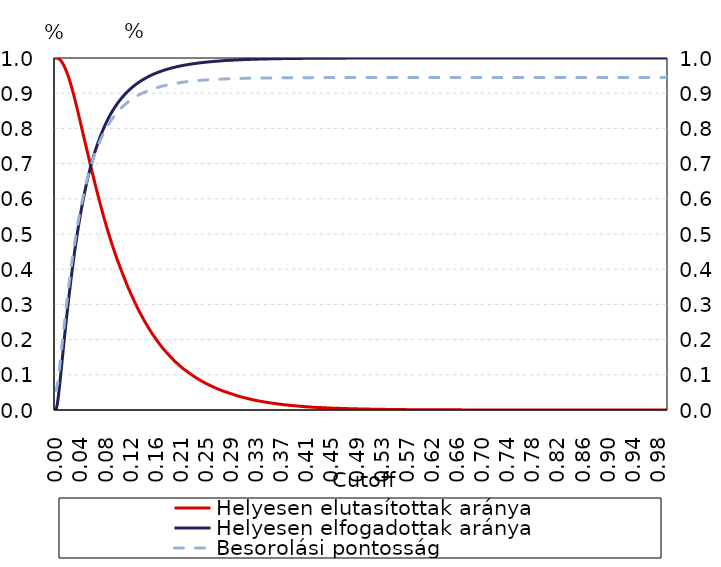
| Category | Helyesen elutasítottak aránya | Helyesen elfogadottak aránya |
|---|---|---|
| 0.0 | 1 | 0 |
| 0.001 | 1 | 0.002 |
| 0.002 | 1 | 0.006 |
| 0.003 | 1 | 0.014 |
| 0.004 | 0.999 | 0.025 |
| 0.005 | 0.999 | 0.039 |
| 0.006 | 0.998 | 0.054 |
| 0.007 | 0.996 | 0.07 |
| 0.008 | 0.995 | 0.086 |
| 0.009 | 0.993 | 0.103 |
| 0.01 | 0.99 | 0.121 |
| 0.011 | 0.988 | 0.138 |
| 0.012 | 0.985 | 0.155 |
| 0.013 | 0.982 | 0.172 |
| 0.014 | 0.979 | 0.19 |
| 0.015 | 0.975 | 0.207 |
| 0.016 | 0.971 | 0.223 |
| 0.017 | 0.967 | 0.24 |
| 0.018 | 0.963 | 0.256 |
| 0.019 | 0.958 | 0.272 |
| 0.02 | 0.954 | 0.288 |
| 0.021 | 0.949 | 0.303 |
| 0.022 | 0.944 | 0.318 |
| 0.023 | 0.938 | 0.333 |
| 0.024 | 0.933 | 0.348 |
| 0.025 | 0.927 | 0.362 |
| 0.026 | 0.921 | 0.376 |
| 0.027 | 0.915 | 0.39 |
| 0.028 | 0.909 | 0.404 |
| 0.029 | 0.902 | 0.417 |
| 0.03 | 0.896 | 0.43 |
| 0.031 | 0.889 | 0.443 |
| 0.032 | 0.882 | 0.455 |
| 0.033 | 0.875 | 0.467 |
| 0.034 | 0.868 | 0.479 |
| 0.035 | 0.861 | 0.491 |
| 0.036 | 0.854 | 0.502 |
| 0.037 | 0.847 | 0.513 |
| 0.038 | 0.839 | 0.524 |
| 0.039 | 0.832 | 0.535 |
| 0.04 | 0.825 | 0.545 |
| 0.041 | 0.818 | 0.555 |
| 0.042 | 0.81 | 0.565 |
| 0.043 | 0.802 | 0.575 |
| 0.044 | 0.795 | 0.584 |
| 0.045 | 0.787 | 0.593 |
| 0.046 | 0.779 | 0.602 |
| 0.047 | 0.772 | 0.611 |
| 0.048 | 0.765 | 0.619 |
| 0.049 | 0.758 | 0.627 |
| 0.05 | 0.75 | 0.635 |
| 0.051 | 0.743 | 0.643 |
| 0.052 | 0.736 | 0.651 |
| 0.053 | 0.728 | 0.659 |
| 0.054 | 0.721 | 0.666 |
| 0.055 | 0.714 | 0.673 |
| 0.056 | 0.707 | 0.68 |
| 0.057 | 0.699 | 0.687 |
| 0.058 | 0.692 | 0.693 |
| 0.059 | 0.685 | 0.699 |
| 0.06 | 0.677 | 0.706 |
| 0.061 | 0.67 | 0.712 |
| 0.062 | 0.663 | 0.718 |
| 0.063 | 0.656 | 0.724 |
| 0.064 | 0.649 | 0.729 |
| 0.065 | 0.642 | 0.735 |
| 0.066 | 0.635 | 0.74 |
| 0.067 | 0.628 | 0.746 |
| 0.068 | 0.621 | 0.751 |
| 0.069 | 0.615 | 0.756 |
| 0.07 | 0.608 | 0.761 |
| 0.071 | 0.601 | 0.766 |
| 0.072 | 0.595 | 0.77 |
| 0.073 | 0.588 | 0.775 |
| 0.074 | 0.581 | 0.779 |
| 0.075 | 0.575 | 0.784 |
| 0.076 | 0.569 | 0.788 |
| 0.077 | 0.562 | 0.792 |
| 0.078 | 0.556 | 0.797 |
| 0.079 | 0.549 | 0.801 |
| 0.08 | 0.543 | 0.805 |
| 0.081 | 0.537 | 0.808 |
| 0.082 | 0.531 | 0.812 |
| 0.083 | 0.525 | 0.816 |
| 0.084 | 0.519 | 0.82 |
| 0.085 | 0.513 | 0.823 |
| 0.086 | 0.508 | 0.827 |
| 0.087 | 0.502 | 0.83 |
| 0.088 | 0.496 | 0.833 |
| 0.089 | 0.49 | 0.836 |
| 0.09 | 0.485 | 0.839 |
| 0.091 | 0.48 | 0.843 |
| 0.092 | 0.474 | 0.846 |
| 0.093 | 0.469 | 0.848 |
| 0.094 | 0.463 | 0.851 |
| 0.095 | 0.458 | 0.854 |
| 0.096 | 0.453 | 0.857 |
| 0.097 | 0.448 | 0.86 |
| 0.098 | 0.443 | 0.862 |
| 0.099 | 0.438 | 0.865 |
| 0.1 | 0.433 | 0.867 |
| 0.101 | 0.428 | 0.87 |
| 0.102 | 0.423 | 0.872 |
| 0.103 | 0.419 | 0.875 |
| 0.104 | 0.414 | 0.877 |
| 0.105 | 0.409 | 0.879 |
| 0.106 | 0.405 | 0.881 |
| 0.107 | 0.4 | 0.883 |
| 0.108 | 0.396 | 0.886 |
| 0.109 | 0.391 | 0.888 |
| 0.11 | 0.387 | 0.89 |
| 0.111 | 0.382 | 0.892 |
| 0.112 | 0.378 | 0.894 |
| 0.113 | 0.373 | 0.896 |
| 0.114 | 0.369 | 0.898 |
| 0.115 | 0.365 | 0.899 |
| 0.116 | 0.36 | 0.901 |
| 0.117 | 0.356 | 0.903 |
| 0.118 | 0.352 | 0.905 |
| 0.119 | 0.348 | 0.906 |
| 0.12 | 0.344 | 0.908 |
| 0.121 | 0.34 | 0.91 |
| 0.122 | 0.336 | 0.911 |
| 0.123 | 0.332 | 0.913 |
| 0.124 | 0.328 | 0.914 |
| 0.125 | 0.324 | 0.916 |
| 0.126 | 0.321 | 0.917 |
| 0.127 | 0.317 | 0.919 |
| 0.128 | 0.313 | 0.92 |
| 0.129 | 0.309 | 0.922 |
| 0.13 | 0.305 | 0.923 |
| 0.131 | 0.302 | 0.924 |
| 0.132 | 0.298 | 0.925 |
| 0.133 | 0.295 | 0.927 |
| 0.134 | 0.291 | 0.928 |
| 0.135 | 0.287 | 0.929 |
| 0.136 | 0.284 | 0.93 |
| 0.137 | 0.28 | 0.932 |
| 0.138 | 0.277 | 0.933 |
| 0.139 | 0.274 | 0.934 |
| 0.14 | 0.271 | 0.935 |
| 0.141 | 0.268 | 0.936 |
| 0.142 | 0.264 | 0.937 |
| 0.143 | 0.261 | 0.938 |
| 0.144 | 0.258 | 0.939 |
| 0.145 | 0.255 | 0.94 |
| 0.146 | 0.251 | 0.941 |
| 0.147 | 0.248 | 0.942 |
| 0.148 | 0.246 | 0.943 |
| 0.149 | 0.243 | 0.944 |
| 0.15 | 0.24 | 0.945 |
| 0.151 | 0.237 | 0.946 |
| 0.152 | 0.234 | 0.947 |
| 0.153 | 0.231 | 0.948 |
| 0.154 | 0.228 | 0.949 |
| 0.155 | 0.226 | 0.95 |
| 0.156 | 0.223 | 0.951 |
| 0.157 | 0.22 | 0.951 |
| 0.158 | 0.217 | 0.952 |
| 0.159 | 0.215 | 0.953 |
| 0.16 | 0.212 | 0.954 |
| 0.161 | 0.21 | 0.954 |
| 0.162 | 0.208 | 0.955 |
| 0.163 | 0.205 | 0.956 |
| 0.164 | 0.203 | 0.957 |
| 0.165 | 0.2 | 0.957 |
| 0.166 | 0.198 | 0.958 |
| 0.167 | 0.195 | 0.959 |
| 0.168 | 0.193 | 0.959 |
| 0.169 | 0.19 | 0.96 |
| 0.17 | 0.188 | 0.961 |
| 0.171 | 0.186 | 0.961 |
| 0.172 | 0.183 | 0.962 |
| 0.173 | 0.181 | 0.963 |
| 0.174 | 0.179 | 0.963 |
| 0.175 | 0.177 | 0.964 |
| 0.176 | 0.175 | 0.964 |
| 0.177 | 0.173 | 0.965 |
| 0.178 | 0.171 | 0.965 |
| 0.179 | 0.169 | 0.966 |
| 0.18 | 0.167 | 0.967 |
| 0.181 | 0.165 | 0.967 |
| 0.182 | 0.163 | 0.968 |
| 0.183 | 0.161 | 0.968 |
| 0.184 | 0.159 | 0.969 |
| 0.185 | 0.157 | 0.969 |
| 0.186 | 0.155 | 0.97 |
| 0.187 | 0.153 | 0.97 |
| 0.188 | 0.151 | 0.971 |
| 0.189 | 0.15 | 0.971 |
| 0.19 | 0.148 | 0.972 |
| 0.191 | 0.146 | 0.972 |
| 0.192 | 0.144 | 0.972 |
| 0.193 | 0.142 | 0.973 |
| 0.194 | 0.141 | 0.973 |
| 0.195 | 0.139 | 0.974 |
| 0.196 | 0.137 | 0.974 |
| 0.197 | 0.136 | 0.975 |
| 0.198 | 0.134 | 0.975 |
| 0.199 | 0.133 | 0.975 |
| 0.2 | 0.131 | 0.976 |
| 0.201 | 0.129 | 0.976 |
| 0.202 | 0.128 | 0.977 |
| 0.203 | 0.126 | 0.977 |
| 0.204 | 0.125 | 0.977 |
| 0.205 | 0.123 | 0.978 |
| 0.206 | 0.122 | 0.978 |
| 0.207 | 0.12 | 0.978 |
| 0.208 | 0.119 | 0.979 |
| 0.209 | 0.117 | 0.979 |
| 0.21 | 0.116 | 0.979 |
| 0.211 | 0.115 | 0.98 |
| 0.212 | 0.113 | 0.98 |
| 0.213 | 0.112 | 0.98 |
| 0.214 | 0.111 | 0.981 |
| 0.215 | 0.11 | 0.981 |
| 0.216 | 0.108 | 0.981 |
| 0.217 | 0.107 | 0.981 |
| 0.218 | 0.106 | 0.982 |
| 0.219 | 0.105 | 0.982 |
| 0.22 | 0.103 | 0.982 |
| 0.221 | 0.102 | 0.983 |
| 0.222 | 0.101 | 0.983 |
| 0.223 | 0.1 | 0.983 |
| 0.224 | 0.098 | 0.983 |
| 0.225 | 0.097 | 0.984 |
| 0.226 | 0.096 | 0.984 |
| 0.227 | 0.095 | 0.984 |
| 0.228 | 0.094 | 0.984 |
| 0.229 | 0.092 | 0.985 |
| 0.23 | 0.091 | 0.985 |
| 0.231 | 0.09 | 0.985 |
| 0.232 | 0.089 | 0.985 |
| 0.233 | 0.088 | 0.986 |
| 0.234 | 0.087 | 0.986 |
| 0.235 | 0.086 | 0.986 |
| 0.236 | 0.085 | 0.986 |
| 0.237 | 0.084 | 0.986 |
| 0.238 | 0.083 | 0.987 |
| 0.239 | 0.082 | 0.987 |
| 0.24 | 0.081 | 0.987 |
| 0.241 | 0.08 | 0.987 |
| 0.242 | 0.079 | 0.987 |
| 0.243 | 0.078 | 0.988 |
| 0.244 | 0.077 | 0.988 |
| 0.245 | 0.076 | 0.988 |
| 0.246 | 0.076 | 0.988 |
| 0.247 | 0.075 | 0.988 |
| 0.248 | 0.074 | 0.989 |
| 0.249 | 0.073 | 0.989 |
| 0.25 | 0.072 | 0.989 |
| 0.251 | 0.071 | 0.989 |
| 0.252 | 0.07 | 0.989 |
| 0.253 | 0.069 | 0.989 |
| 0.254 | 0.069 | 0.99 |
| 0.255 | 0.068 | 0.99 |
| 0.256 | 0.067 | 0.99 |
| 0.257 | 0.066 | 0.99 |
| 0.258 | 0.065 | 0.99 |
| 0.259 | 0.065 | 0.99 |
| 0.26 | 0.064 | 0.99 |
| 0.261 | 0.063 | 0.991 |
| 0.262 | 0.062 | 0.991 |
| 0.263 | 0.062 | 0.991 |
| 0.264 | 0.061 | 0.991 |
| 0.265 | 0.06 | 0.991 |
| 0.266 | 0.059 | 0.991 |
| 0.267 | 0.059 | 0.991 |
| 0.268 | 0.058 | 0.992 |
| 0.269 | 0.057 | 0.992 |
| 0.27 | 0.057 | 0.992 |
| 0.271 | 0.056 | 0.992 |
| 0.272 | 0.055 | 0.992 |
| 0.273 | 0.054 | 0.992 |
| 0.274 | 0.054 | 0.992 |
| 0.275 | 0.053 | 0.992 |
| 0.276 | 0.053 | 0.993 |
| 0.277 | 0.052 | 0.993 |
| 0.278 | 0.052 | 0.993 |
| 0.279 | 0.051 | 0.993 |
| 0.28 | 0.05 | 0.993 |
| 0.281 | 0.05 | 0.993 |
| 0.282 | 0.049 | 0.993 |
| 0.283 | 0.048 | 0.993 |
| 0.284 | 0.048 | 0.993 |
| 0.285 | 0.047 | 0.993 |
| 0.286 | 0.047 | 0.994 |
| 0.287 | 0.046 | 0.994 |
| 0.288 | 0.046 | 0.994 |
| 0.289 | 0.045 | 0.994 |
| 0.29 | 0.045 | 0.994 |
| 0.291 | 0.044 | 0.994 |
| 0.292 | 0.043 | 0.994 |
| 0.293 | 0.043 | 0.994 |
| 0.294 | 0.042 | 0.994 |
| 0.295 | 0.042 | 0.994 |
| 0.296 | 0.041 | 0.994 |
| 0.297 | 0.041 | 0.995 |
| 0.298 | 0.04 | 0.995 |
| 0.299 | 0.04 | 0.995 |
| 0.3 | 0.039 | 0.995 |
| 0.301 | 0.039 | 0.995 |
| 0.302 | 0.038 | 0.995 |
| 0.303 | 0.038 | 0.995 |
| 0.304 | 0.037 | 0.995 |
| 0.305 | 0.037 | 0.995 |
| 0.306 | 0.036 | 0.995 |
| 0.307 | 0.036 | 0.995 |
| 0.308 | 0.035 | 0.995 |
| 0.309 | 0.035 | 0.995 |
| 0.31 | 0.034 | 0.996 |
| 0.311 | 0.034 | 0.996 |
| 0.312 | 0.033 | 0.996 |
| 0.313 | 0.033 | 0.996 |
| 0.314 | 0.033 | 0.996 |
| 0.315 | 0.032 | 0.996 |
| 0.316 | 0.032 | 0.996 |
| 0.317 | 0.031 | 0.996 |
| 0.318 | 0.031 | 0.996 |
| 0.319 | 0.031 | 0.996 |
| 0.32 | 0.03 | 0.996 |
| 0.321 | 0.03 | 0.996 |
| 0.322 | 0.029 | 0.996 |
| 0.323 | 0.029 | 0.996 |
| 0.324 | 0.029 | 0.996 |
| 0.325 | 0.028 | 0.996 |
| 0.326 | 0.028 | 0.997 |
| 0.327 | 0.027 | 0.997 |
| 0.328 | 0.027 | 0.997 |
| 0.329 | 0.027 | 0.997 |
| 0.33 | 0.026 | 0.997 |
| 0.331 | 0.026 | 0.997 |
| 0.332 | 0.026 | 0.997 |
| 0.333 | 0.025 | 0.997 |
| 0.334 | 0.025 | 0.997 |
| 0.335 | 0.025 | 0.997 |
| 0.336 | 0.024 | 0.997 |
| 0.337 | 0.024 | 0.997 |
| 0.338 | 0.024 | 0.997 |
| 0.339 | 0.024 | 0.997 |
| 0.34 | 0.023 | 0.997 |
| 0.341 | 0.023 | 0.997 |
| 0.342 | 0.023 | 0.997 |
| 0.343 | 0.023 | 0.997 |
| 0.344 | 0.022 | 0.997 |
| 0.345 | 0.022 | 0.997 |
| 0.346 | 0.022 | 0.997 |
| 0.347 | 0.021 | 0.997 |
| 0.348 | 0.021 | 0.998 |
| 0.349 | 0.021 | 0.998 |
| 0.35 | 0.021 | 0.998 |
| 0.351 | 0.02 | 0.998 |
| 0.352 | 0.02 | 0.998 |
| 0.353 | 0.02 | 0.998 |
| 0.354 | 0.019 | 0.998 |
| 0.355 | 0.019 | 0.998 |
| 0.356 | 0.019 | 0.998 |
| 0.357 | 0.019 | 0.998 |
| 0.358 | 0.018 | 0.998 |
| 0.359 | 0.018 | 0.998 |
| 0.36 | 0.018 | 0.998 |
| 0.361 | 0.018 | 0.998 |
| 0.362 | 0.018 | 0.998 |
| 0.363 | 0.017 | 0.998 |
| 0.364 | 0.017 | 0.998 |
| 0.365 | 0.017 | 0.998 |
| 0.366 | 0.017 | 0.998 |
| 0.367 | 0.016 | 0.998 |
| 0.368 | 0.016 | 0.998 |
| 0.369 | 0.016 | 0.998 |
| 0.37 | 0.016 | 0.998 |
| 0.371 | 0.015 | 0.998 |
| 0.372 | 0.015 | 0.998 |
| 0.373 | 0.015 | 0.998 |
| 0.374 | 0.015 | 0.998 |
| 0.375 | 0.015 | 0.998 |
| 0.376 | 0.015 | 0.998 |
| 0.377 | 0.014 | 0.998 |
| 0.378 | 0.014 | 0.998 |
| 0.379 | 0.014 | 0.998 |
| 0.38 | 0.014 | 0.998 |
| 0.381 | 0.014 | 0.999 |
| 0.382 | 0.013 | 0.999 |
| 0.383 | 0.013 | 0.999 |
| 0.384 | 0.013 | 0.999 |
| 0.385 | 0.013 | 0.999 |
| 0.386 | 0.013 | 0.999 |
| 0.387 | 0.013 | 0.999 |
| 0.388 | 0.012 | 0.999 |
| 0.389 | 0.012 | 0.999 |
| 0.39 | 0.012 | 0.999 |
| 0.391 | 0.012 | 0.999 |
| 0.392 | 0.012 | 0.999 |
| 0.393 | 0.012 | 0.999 |
| 0.394 | 0.012 | 0.999 |
| 0.395 | 0.011 | 0.999 |
| 0.396 | 0.011 | 0.999 |
| 0.397 | 0.011 | 0.999 |
| 0.398 | 0.011 | 0.999 |
| 0.399 | 0.011 | 0.999 |
| 0.4 | 0.011 | 0.999 |
| 0.401 | 0.01 | 0.999 |
| 0.402 | 0.01 | 0.999 |
| 0.403 | 0.01 | 0.999 |
| 0.404 | 0.01 | 0.999 |
| 0.405 | 0.01 | 0.999 |
| 0.406 | 0.01 | 0.999 |
| 0.407 | 0.01 | 0.999 |
| 0.408 | 0.009 | 0.999 |
| 0.409 | 0.009 | 0.999 |
| 0.41 | 0.009 | 0.999 |
| 0.411 | 0.009 | 0.999 |
| 0.412 | 0.009 | 0.999 |
| 0.413 | 0.009 | 0.999 |
| 0.414 | 0.009 | 0.999 |
| 0.415 | 0.009 | 0.999 |
| 0.416 | 0.008 | 0.999 |
| 0.417 | 0.008 | 0.999 |
| 0.418 | 0.008 | 0.999 |
| 0.419 | 0.008 | 0.999 |
| 0.42 | 0.008 | 0.999 |
| 0.421 | 0.008 | 0.999 |
| 0.422 | 0.008 | 0.999 |
| 0.423 | 0.008 | 0.999 |
| 0.424 | 0.007 | 0.999 |
| 0.425 | 0.007 | 0.999 |
| 0.426 | 0.007 | 0.999 |
| 0.427 | 0.007 | 0.999 |
| 0.428 | 0.007 | 0.999 |
| 0.429 | 0.007 | 0.999 |
| 0.43 | 0.007 | 0.999 |
| 0.431 | 0.007 | 0.999 |
| 0.432 | 0.007 | 0.999 |
| 0.433 | 0.007 | 0.999 |
| 0.434 | 0.007 | 0.999 |
| 0.435 | 0.007 | 0.999 |
| 0.436 | 0.007 | 0.999 |
| 0.437 | 0.006 | 0.999 |
| 0.438 | 0.006 | 0.999 |
| 0.439 | 0.006 | 0.999 |
| 0.44 | 0.006 | 0.999 |
| 0.441 | 0.006 | 0.999 |
| 0.442 | 0.006 | 0.999 |
| 0.443 | 0.006 | 0.999 |
| 0.444 | 0.006 | 0.999 |
| 0.445 | 0.006 | 0.999 |
| 0.446 | 0.006 | 0.999 |
| 0.447 | 0.006 | 0.999 |
| 0.448 | 0.006 | 0.999 |
| 0.449 | 0.005 | 0.999 |
| 0.45 | 0.005 | 0.999 |
| 0.451 | 0.005 | 0.999 |
| 0.452 | 0.005 | 0.999 |
| 0.453 | 0.005 | 1 |
| 0.454 | 0.005 | 1 |
| 0.455 | 0.005 | 1 |
| 0.456 | 0.005 | 1 |
| 0.457 | 0.005 | 1 |
| 0.458 | 0.005 | 1 |
| 0.459 | 0.005 | 1 |
| 0.46 | 0.005 | 1 |
| 0.461 | 0.005 | 1 |
| 0.462 | 0.005 | 1 |
| 0.463 | 0.005 | 1 |
| 0.464 | 0.005 | 1 |
| 0.465 | 0.005 | 1 |
| 0.466 | 0.005 | 1 |
| 0.467 | 0.005 | 1 |
| 0.468 | 0.004 | 1 |
| 0.469 | 0.004 | 1 |
| 0.47 | 0.004 | 1 |
| 0.471 | 0.004 | 1 |
| 0.472 | 0.004 | 1 |
| 0.473 | 0.004 | 1 |
| 0.474 | 0.004 | 1 |
| 0.475 | 0.004 | 1 |
| 0.476 | 0.004 | 1 |
| 0.477 | 0.004 | 1 |
| 0.478 | 0.004 | 1 |
| 0.479 | 0.004 | 1 |
| 0.48 | 0.004 | 1 |
| 0.481 | 0.004 | 1 |
| 0.482 | 0.004 | 1 |
| 0.483 | 0.004 | 1 |
| 0.484 | 0.004 | 1 |
| 0.485 | 0.004 | 1 |
| 0.486 | 0.004 | 1 |
| 0.487 | 0.003 | 1 |
| 0.488 | 0.003 | 1 |
| 0.489 | 0.003 | 1 |
| 0.49 | 0.003 | 1 |
| 0.491 | 0.003 | 1 |
| 0.492 | 0.003 | 1 |
| 0.493 | 0.003 | 1 |
| 0.494 | 0.003 | 1 |
| 0.495 | 0.003 | 1 |
| 0.496 | 0.003 | 1 |
| 0.497 | 0.003 | 1 |
| 0.498 | 0.003 | 1 |
| 0.499 | 0.003 | 1 |
| 0.5 | 0.003 | 1 |
| 0.501 | 0.003 | 1 |
| 0.502 | 0.003 | 1 |
| 0.503 | 0.003 | 1 |
| 0.504 | 0.003 | 1 |
| 0.505 | 0.003 | 1 |
| 0.506 | 0.003 | 1 |
| 0.507 | 0.003 | 1 |
| 0.508 | 0.003 | 1 |
| 0.509 | 0.003 | 1 |
| 0.51 | 0.003 | 1 |
| 0.511 | 0.003 | 1 |
| 0.512 | 0.003 | 1 |
| 0.513 | 0.002 | 1 |
| 0.514 | 0.002 | 1 |
| 0.515 | 0.002 | 1 |
| 0.516 | 0.002 | 1 |
| 0.517 | 0.002 | 1 |
| 0.518 | 0.002 | 1 |
| 0.519 | 0.002 | 1 |
| 0.52 | 0.002 | 1 |
| 0.521 | 0.002 | 1 |
| 0.522 | 0.002 | 1 |
| 0.523 | 0.002 | 1 |
| 0.524 | 0.002 | 1 |
| 0.525 | 0.002 | 1 |
| 0.526 | 0.002 | 1 |
| 0.527 | 0.002 | 1 |
| 0.528 | 0.002 | 1 |
| 0.529 | 0.002 | 1 |
| 0.53 | 0.002 | 1 |
| 0.531 | 0.002 | 1 |
| 0.532 | 0.002 | 1 |
| 0.533 | 0.002 | 1 |
| 0.534 | 0.002 | 1 |
| 0.535 | 0.002 | 1 |
| 0.536 | 0.002 | 1 |
| 0.537 | 0.002 | 1 |
| 0.538 | 0.002 | 1 |
| 0.539 | 0.002 | 1 |
| 0.54 | 0.002 | 1 |
| 0.541 | 0.002 | 1 |
| 0.542 | 0.002 | 1 |
| 0.543 | 0.002 | 1 |
| 0.544 | 0.002 | 1 |
| 0.545 | 0.002 | 1 |
| 0.546 | 0.002 | 1 |
| 0.547 | 0.002 | 1 |
| 0.548 | 0.002 | 1 |
| 0.549 | 0.002 | 1 |
| 0.55 | 0.001 | 1 |
| 0.551 | 0.001 | 1 |
| 0.552 | 0.001 | 1 |
| 0.553 | 0.001 | 1 |
| 0.554 | 0.001 | 1 |
| 0.555 | 0.001 | 1 |
| 0.556 | 0.001 | 1 |
| 0.557 | 0.001 | 1 |
| 0.558 | 0.001 | 1 |
| 0.559 | 0.001 | 1 |
| 0.56 | 0.001 | 1 |
| 0.561 | 0.001 | 1 |
| 0.562 | 0.001 | 1 |
| 0.563 | 0.001 | 1 |
| 0.564 | 0.001 | 1 |
| 0.565 | 0.001 | 1 |
| 0.566 | 0.001 | 1 |
| 0.567 | 0.001 | 1 |
| 0.568 | 0.001 | 1 |
| 0.569 | 0.001 | 1 |
| 0.57 | 0.001 | 1 |
| 0.571 | 0.001 | 1 |
| 0.572 | 0.001 | 1 |
| 0.573 | 0.001 | 1 |
| 0.574 | 0.001 | 1 |
| 0.575 | 0.001 | 1 |
| 0.576 | 0.001 | 1 |
| 0.577 | 0.001 | 1 |
| 0.578 | 0.001 | 1 |
| 0.579 | 0.001 | 1 |
| 0.58 | 0.001 | 1 |
| 0.581 | 0.001 | 1 |
| 0.582 | 0.001 | 1 |
| 0.583 | 0.001 | 1 |
| 0.584 | 0.001 | 1 |
| 0.585 | 0.001 | 1 |
| 0.586 | 0.001 | 1 |
| 0.587 | 0.001 | 1 |
| 0.588 | 0.001 | 1 |
| 0.589 | 0.001 | 1 |
| 0.59 | 0.001 | 1 |
| 0.591 | 0.001 | 1 |
| 0.592 | 0.001 | 1 |
| 0.593 | 0.001 | 1 |
| 0.594 | 0.001 | 1 |
| 0.595 | 0.001 | 1 |
| 0.596 | 0.001 | 1 |
| 0.597 | 0.001 | 1 |
| 0.598 | 0.001 | 1 |
| 0.599 | 0.001 | 1 |
| 0.6 | 0.001 | 1 |
| 0.601 | 0.001 | 1 |
| 0.602 | 0.001 | 1 |
| 0.603 | 0.001 | 1 |
| 0.604 | 0.001 | 1 |
| 0.605 | 0.001 | 1 |
| 0.606 | 0.001 | 1 |
| 0.607 | 0.001 | 1 |
| 0.608 | 0.001 | 1 |
| 0.609 | 0.001 | 1 |
| 0.61 | 0.001 | 1 |
| 0.611 | 0.001 | 1 |
| 0.612 | 0.001 | 1 |
| 0.613 | 0.001 | 1 |
| 0.614 | 0.001 | 1 |
| 0.615 | 0.001 | 1 |
| 0.616 | 0.001 | 1 |
| 0.617 | 0.001 | 1 |
| 0.618 | 0.001 | 1 |
| 0.619 | 0.001 | 1 |
| 0.62 | 0.001 | 1 |
| 0.621 | 0.001 | 1 |
| 0.622 | 0.001 | 1 |
| 0.623 | 0.001 | 1 |
| 0.624 | 0.001 | 1 |
| 0.625 | 0.001 | 1 |
| 0.626 | 0.001 | 1 |
| 0.627 | 0.001 | 1 |
| 0.628 | 0.001 | 1 |
| 0.629 | 0.001 | 1 |
| 0.63 | 0.001 | 1 |
| 0.631 | 0.001 | 1 |
| 0.632 | 0.001 | 1 |
| 0.633 | 0.001 | 1 |
| 0.634 | 0.001 | 1 |
| 0.635 | 0.001 | 1 |
| 0.636 | 0.001 | 1 |
| 0.637 | 0.001 | 1 |
| 0.638 | 0 | 1 |
| 0.639 | 0 | 1 |
| 0.64 | 0 | 1 |
| 0.641 | 0 | 1 |
| 0.642 | 0 | 1 |
| 0.643 | 0 | 1 |
| 0.644 | 0 | 1 |
| 0.645 | 0 | 1 |
| 0.646 | 0 | 1 |
| 0.647 | 0 | 1 |
| 0.648 | 0 | 1 |
| 0.649 | 0 | 1 |
| 0.65 | 0 | 1 |
| 0.651 | 0 | 1 |
| 0.652 | 0 | 1 |
| 0.653 | 0 | 1 |
| 0.654 | 0 | 1 |
| 0.655 | 0 | 1 |
| 0.656 | 0 | 1 |
| 0.657 | 0 | 1 |
| 0.658 | 0 | 1 |
| 0.659 | 0 | 1 |
| 0.66 | 0 | 1 |
| 0.661 | 0 | 1 |
| 0.662 | 0 | 1 |
| 0.663 | 0 | 1 |
| 0.664 | 0 | 1 |
| 0.665 | 0 | 1 |
| 0.666 | 0 | 1 |
| 0.667 | 0 | 1 |
| 0.668 | 0 | 1 |
| 0.669 | 0 | 1 |
| 0.67 | 0 | 1 |
| 0.671 | 0 | 1 |
| 0.672 | 0 | 1 |
| 0.673 | 0 | 1 |
| 0.674 | 0 | 1 |
| 0.675 | 0 | 1 |
| 0.676 | 0 | 1 |
| 0.677 | 0 | 1 |
| 0.678 | 0 | 1 |
| 0.679 | 0 | 1 |
| 0.68 | 0 | 1 |
| 0.681 | 0 | 1 |
| 0.682 | 0 | 1 |
| 0.683 | 0 | 1 |
| 0.684 | 0 | 1 |
| 0.685 | 0 | 1 |
| 0.686 | 0 | 1 |
| 0.687 | 0 | 1 |
| 0.688 | 0 | 1 |
| 0.689 | 0 | 1 |
| 0.69 | 0 | 1 |
| 0.691 | 0 | 1 |
| 0.692 | 0 | 1 |
| 0.693 | 0 | 1 |
| 0.694 | 0 | 1 |
| 0.695 | 0 | 1 |
| 0.696 | 0 | 1 |
| 0.697 | 0 | 1 |
| 0.698 | 0 | 1 |
| 0.699 | 0 | 1 |
| 0.7 | 0 | 1 |
| 0.701 | 0 | 1 |
| 0.702 | 0 | 1 |
| 0.703 | 0 | 1 |
| 0.704 | 0 | 1 |
| 0.705 | 0 | 1 |
| 0.706 | 0 | 1 |
| 0.707 | 0 | 1 |
| 0.708 | 0 | 1 |
| 0.709 | 0 | 1 |
| 0.71 | 0 | 1 |
| 0.711 | 0 | 1 |
| 0.712 | 0 | 1 |
| 0.713 | 0 | 1 |
| 0.714 | 0 | 1 |
| 0.715 | 0 | 1 |
| 0.716 | 0 | 1 |
| 0.717 | 0 | 1 |
| 0.718 | 0 | 1 |
| 0.719 | 0 | 1 |
| 0.72 | 0 | 1 |
| 0.721 | 0 | 1 |
| 0.722 | 0 | 1 |
| 0.723 | 0 | 1 |
| 0.724 | 0 | 1 |
| 0.725 | 0 | 1 |
| 0.726 | 0 | 1 |
| 0.727 | 0 | 1 |
| 0.728 | 0 | 1 |
| 0.729 | 0 | 1 |
| 0.73 | 0 | 1 |
| 0.731 | 0 | 1 |
| 0.732 | 0 | 1 |
| 0.733 | 0 | 1 |
| 0.734 | 0 | 1 |
| 0.735 | 0 | 1 |
| 0.736 | 0 | 1 |
| 0.737 | 0 | 1 |
| 0.738 | 0 | 1 |
| 0.739 | 0 | 1 |
| 0.74 | 0 | 1 |
| 0.741 | 0 | 1 |
| 0.742 | 0 | 1 |
| 0.743 | 0 | 1 |
| 0.744 | 0 | 1 |
| 0.745 | 0 | 1 |
| 0.746 | 0 | 1 |
| 0.747 | 0 | 1 |
| 0.748 | 0 | 1 |
| 0.749 | 0 | 1 |
| 0.75 | 0 | 1 |
| 0.751 | 0 | 1 |
| 0.752 | 0 | 1 |
| 0.753 | 0 | 1 |
| 0.754 | 0 | 1 |
| 0.755 | 0 | 1 |
| 0.756 | 0 | 1 |
| 0.757 | 0 | 1 |
| 0.758 | 0 | 1 |
| 0.759 | 0 | 1 |
| 0.76 | 0 | 1 |
| 0.761 | 0 | 1 |
| 0.762 | 0 | 1 |
| 0.763 | 0 | 1 |
| 0.764 | 0 | 1 |
| 0.765 | 0 | 1 |
| 0.766 | 0 | 1 |
| 0.767 | 0 | 1 |
| 0.768 | 0 | 1 |
| 0.769 | 0 | 1 |
| 0.77 | 0 | 1 |
| 0.771 | 0 | 1 |
| 0.772 | 0 | 1 |
| 0.773 | 0 | 1 |
| 0.774 | 0 | 1 |
| 0.775 | 0 | 1 |
| 0.776 | 0 | 1 |
| 0.777 | 0 | 1 |
| 0.778 | 0 | 1 |
| 0.779 | 0 | 1 |
| 0.78 | 0 | 1 |
| 0.781 | 0 | 1 |
| 0.782 | 0 | 1 |
| 0.783 | 0 | 1 |
| 0.784 | 0 | 1 |
| 0.785 | 0 | 1 |
| 0.786 | 0 | 1 |
| 0.787 | 0 | 1 |
| 0.788 | 0 | 1 |
| 0.789 | 0 | 1 |
| 0.79 | 0 | 1 |
| 0.791 | 0 | 1 |
| 0.792 | 0 | 1 |
| 0.793 | 0 | 1 |
| 0.794 | 0 | 1 |
| 0.795 | 0 | 1 |
| 0.796 | 0 | 1 |
| 0.797 | 0 | 1 |
| 0.798 | 0 | 1 |
| 0.799 | 0 | 1 |
| 0.8 | 0 | 1 |
| 0.801 | 0 | 1 |
| 0.802 | 0 | 1 |
| 0.803 | 0 | 1 |
| 0.804 | 0 | 1 |
| 0.805 | 0 | 1 |
| 0.806 | 0 | 1 |
| 0.807 | 0 | 1 |
| 0.808 | 0 | 1 |
| 0.809 | 0 | 1 |
| 0.81 | 0 | 1 |
| 0.811 | 0 | 1 |
| 0.812 | 0 | 1 |
| 0.813 | 0 | 1 |
| 0.814 | 0 | 1 |
| 0.815 | 0 | 1 |
| 0.816 | 0 | 1 |
| 0.817 | 0 | 1 |
| 0.818 | 0 | 1 |
| 0.819 | 0 | 1 |
| 0.82 | 0 | 1 |
| 0.821 | 0 | 1 |
| 0.822 | 0 | 1 |
| 0.823 | 0 | 1 |
| 0.824 | 0 | 1 |
| 0.825 | 0 | 1 |
| 0.826 | 0 | 1 |
| 0.827 | 0 | 1 |
| 0.828 | 0 | 1 |
| 0.829 | 0 | 1 |
| 0.83 | 0 | 1 |
| 0.831 | 0 | 1 |
| 0.832 | 0 | 1 |
| 0.833 | 0 | 1 |
| 0.834 | 0 | 1 |
| 0.835 | 0 | 1 |
| 0.836 | 0 | 1 |
| 0.837 | 0 | 1 |
| 0.838 | 0 | 1 |
| 0.839 | 0 | 1 |
| 0.84 | 0 | 1 |
| 0.841 | 0 | 1 |
| 0.842 | 0 | 1 |
| 0.843 | 0 | 1 |
| 0.844 | 0 | 1 |
| 0.845 | 0 | 1 |
| 0.846 | 0 | 1 |
| 0.847 | 0 | 1 |
| 0.848 | 0 | 1 |
| 0.849 | 0 | 1 |
| 0.85 | 0 | 1 |
| 0.851 | 0 | 1 |
| 0.852 | 0 | 1 |
| 0.853 | 0 | 1 |
| 0.854 | 0 | 1 |
| 0.855 | 0 | 1 |
| 0.856 | 0 | 1 |
| 0.857 | 0 | 1 |
| 0.858 | 0 | 1 |
| 0.859 | 0 | 1 |
| 0.86 | 0 | 1 |
| 0.861 | 0 | 1 |
| 0.862 | 0 | 1 |
| 0.863 | 0 | 1 |
| 0.864 | 0 | 1 |
| 0.865 | 0 | 1 |
| 0.866 | 0 | 1 |
| 0.867 | 0 | 1 |
| 0.868 | 0 | 1 |
| 0.869 | 0 | 1 |
| 0.87 | 0 | 1 |
| 0.871 | 0 | 1 |
| 0.872 | 0 | 1 |
| 0.873 | 0 | 1 |
| 0.874 | 0 | 1 |
| 0.875 | 0 | 1 |
| 0.876 | 0 | 1 |
| 0.877 | 0 | 1 |
| 0.878 | 0 | 1 |
| 0.879 | 0 | 1 |
| 0.88 | 0 | 1 |
| 0.881 | 0 | 1 |
| 0.882 | 0 | 1 |
| 0.883 | 0 | 1 |
| 0.884 | 0 | 1 |
| 0.885 | 0 | 1 |
| 0.886 | 0 | 1 |
| 0.887 | 0 | 1 |
| 0.888 | 0 | 1 |
| 0.889 | 0 | 1 |
| 0.89 | 0 | 1 |
| 0.891 | 0 | 1 |
| 0.892 | 0 | 1 |
| 0.893 | 0 | 1 |
| 0.894 | 0 | 1 |
| 0.895 | 0 | 1 |
| 0.896 | 0 | 1 |
| 0.897 | 0 | 1 |
| 0.898 | 0 | 1 |
| 0.899 | 0 | 1 |
| 0.9 | 0 | 1 |
| 0.901 | 0 | 1 |
| 0.902 | 0 | 1 |
| 0.903 | 0 | 1 |
| 0.904 | 0 | 1 |
| 0.905 | 0 | 1 |
| 0.906 | 0 | 1 |
| 0.907 | 0 | 1 |
| 0.908 | 0 | 1 |
| 0.909 | 0 | 1 |
| 0.91 | 0 | 1 |
| 0.911 | 0 | 1 |
| 0.912 | 0 | 1 |
| 0.913 | 0 | 1 |
| 0.914 | 0 | 1 |
| 0.915 | 0 | 1 |
| 0.916 | 0 | 1 |
| 0.917 | 0 | 1 |
| 0.918 | 0 | 1 |
| 0.919 | 0 | 1 |
| 0.92 | 0 | 1 |
| 0.921 | 0 | 1 |
| 0.922 | 0 | 1 |
| 0.923 | 0 | 1 |
| 0.924 | 0 | 1 |
| 0.925 | 0 | 1 |
| 0.926 | 0 | 1 |
| 0.927 | 0 | 1 |
| 0.928 | 0 | 1 |
| 0.929 | 0 | 1 |
| 0.93 | 0 | 1 |
| 0.931 | 0 | 1 |
| 0.932 | 0 | 1 |
| 0.933 | 0 | 1 |
| 0.934 | 0 | 1 |
| 0.935 | 0 | 1 |
| 0.936 | 0 | 1 |
| 0.937 | 0 | 1 |
| 0.938 | 0 | 1 |
| 0.939 | 0 | 1 |
| 0.94 | 0 | 1 |
| 0.941 | 0 | 1 |
| 0.942 | 0 | 1 |
| 0.943 | 0 | 1 |
| 0.944 | 0 | 1 |
| 0.945 | 0 | 1 |
| 0.946 | 0 | 1 |
| 0.947 | 0 | 1 |
| 0.948 | 0 | 1 |
| 0.949 | 0 | 1 |
| 0.95 | 0 | 1 |
| 0.951 | 0 | 1 |
| 0.952 | 0 | 1 |
| 0.953 | 0 | 1 |
| 0.954 | 0 | 1 |
| 0.955 | 0 | 1 |
| 0.956 | 0 | 1 |
| 0.957 | 0 | 1 |
| 0.958 | 0 | 1 |
| 0.959 | 0 | 1 |
| 0.96 | 0 | 1 |
| 0.961 | 0 | 1 |
| 0.962 | 0 | 1 |
| 0.963 | 0 | 1 |
| 0.964 | 0 | 1 |
| 0.965 | 0 | 1 |
| 0.966 | 0 | 1 |
| 0.967 | 0 | 1 |
| 0.968 | 0 | 1 |
| 0.969 | 0 | 1 |
| 0.97 | 0 | 1 |
| 0.971 | 0 | 1 |
| 0.972 | 0 | 1 |
| 0.973 | 0 | 1 |
| 0.974 | 0 | 1 |
| 0.975 | 0 | 1 |
| 0.976 | 0 | 1 |
| 0.977 | 0 | 1 |
| 0.978 | 0 | 1 |
| 0.979 | 0 | 1 |
| 0.98 | 0 | 1 |
| 0.981 | 0 | 1 |
| 0.982 | 0 | 1 |
| 0.983 | 0 | 1 |
| 0.984 | 0 | 1 |
| 0.985 | 0 | 1 |
| 0.986 | 0 | 1 |
| 0.987 | 0 | 1 |
| 0.988 | 0 | 1 |
| 0.989 | 0 | 1 |
| 0.99 | 0 | 1 |
| 0.991 | 0 | 1 |
| 0.992 | 0 | 1 |
| 0.993 | 0 | 1 |
| 0.994 | 0 | 1 |
| 0.995 | 0 | 1 |
| 0.996 | 0 | 1 |
| 0.997 | 0 | 1 |
| 0.998 | 0 | 1 |
| 0.999 | 0 | 1 |
| 1.0 | 0 | 1 |